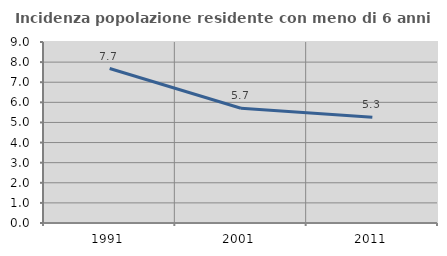
| Category | Incidenza popolazione residente con meno di 6 anni |
|---|---|
| 1991.0 | 7.679 |
| 2001.0 | 5.708 |
| 2011.0 | 5.254 |